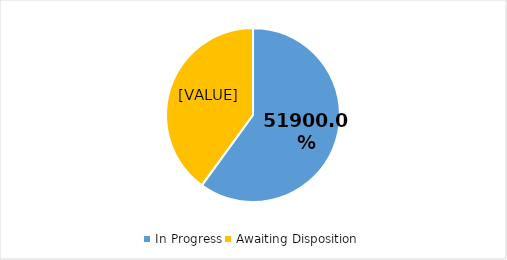
| Category | Series 0 |
|---|---|
| In Progress | 519 |
| Awaiting Disposition | 346 |